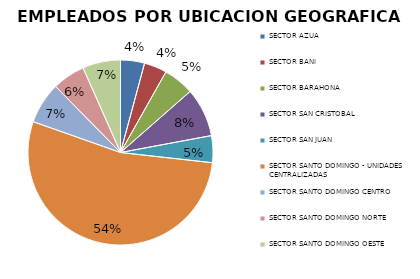
| Category | Series 0 |
|---|---|
| SECTOR AZUA | 117 |
| SECTOR BANI | 111 |
| SECTOR BARAHONA | 150 |
| SECTOR SAN CRISTOBAL | 238 |
| SECTOR SAN JUAN | 131 |
| SECTOR SANTO DOMINGO - UNIDADES CENTRALIZADAS | 1497 |
| SECTOR SANTO DOMINGO CENTRO | 202 |
| SECTOR SANTO DOMINGO NORTE | 160 |
| SECTOR SANTO DOMINGO OESTE | 185 |